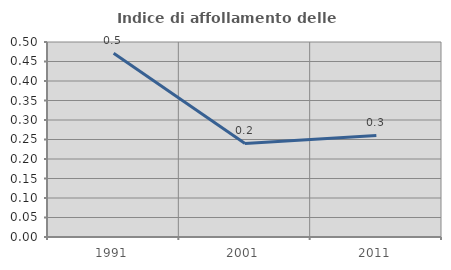
| Category | Indice di affollamento delle abitazioni  |
|---|---|
| 1991.0 | 0.471 |
| 2001.0 | 0.24 |
| 2011.0 | 0.26 |